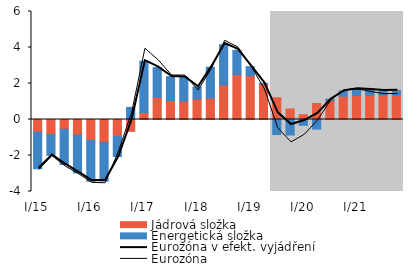
| Category | Jádrová složka | Energetická složka |
|---|---|---|
| I/15 | -0.711 | -2.024 |
| II | -0.841 | -1.148 |
| III | -0.549 | -1.953 |
| IV | -0.865 | -2.104 |
| I/16 | -1.16 | -2.271 |
| II | -1.271 | -2.151 |
| III | -0.929 | -1.123 |
| IV | -0.656 | 0.675 |
| I/17 | 0.384 | 2.852 |
| II | 1.226 | 1.659 |
| III | 1.059 | 1.316 |
| IV | 1.027 | 1.322 |
| I/18 | 1.145 | 0.664 |
| II | 1.189 | 1.718 |
| III | 1.916 | 2.239 |
| IV | 2.49 | 1.354 |
| I/19 | 2.429 | 0.504 |
| II | 1.987 | 0.025 |
| III | 1.207 | -0.835 |
| IV | 0.582 | -0.863 |
| I/20 | 0.267 | -0.325 |
| II | 0.888 | -0.535 |
| III | 1.062 | 0.071 |
| IV | 1.294 | 0.295 |
| I/21 | 1.338 | 0.36 |
| II | 1.356 | 0.303 |
| III | 1.362 | 0.244 |
| IV | 1.368 | 0.246 |